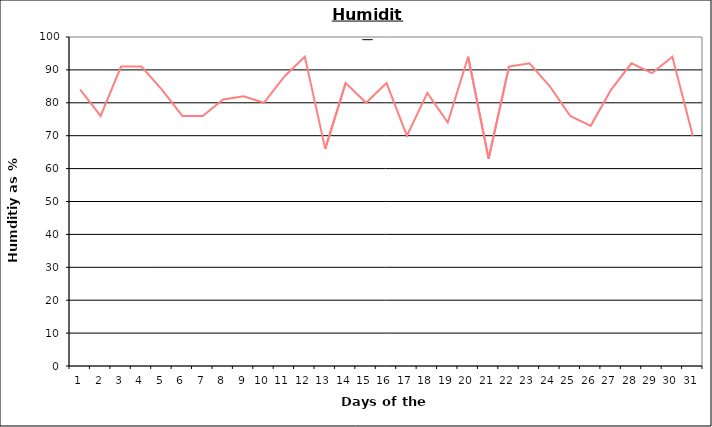
| Category | Series 0 |
|---|---|
| 0 | 84 |
| 1 | 76 |
| 2 | 91 |
| 3 | 91 |
| 4 | 84 |
| 5 | 76 |
| 6 | 76 |
| 7 | 81 |
| 8 | 82 |
| 9 | 80 |
| 10 | 88 |
| 11 | 94 |
| 12 | 66 |
| 13 | 86 |
| 14 | 80 |
| 15 | 86 |
| 16 | 70 |
| 17 | 83 |
| 18 | 74 |
| 19 | 94 |
| 20 | 63 |
| 21 | 91 |
| 22 | 92 |
| 23 | 85 |
| 24 | 76 |
| 25 | 73 |
| 26 | 84 |
| 27 | 92 |
| 28 | 89 |
| 29 | 94 |
| 30 | 70 |